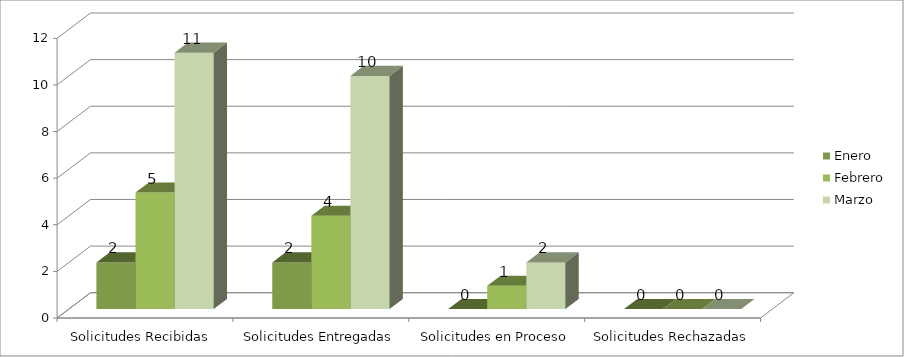
| Category | Enero | Febrero | Marzo |
|---|---|---|---|
| Solicitudes Recibidas  | 2 | 5 | 11 |
| Solicitudes Entregadas | 2 | 4 | 10 |
| Solicitudes en Proceso | 0 | 1 | 2 |
| Solicitudes Rechazadas | 0 | 0 | 0 |